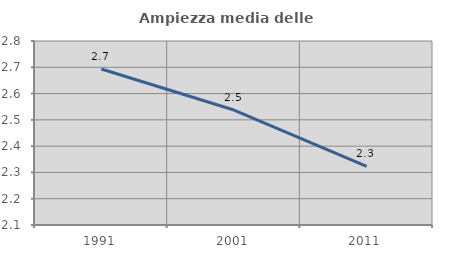
| Category | Ampiezza media delle famiglie |
|---|---|
| 1991.0 | 2.693 |
| 2001.0 | 2.537 |
| 2011.0 | 2.323 |